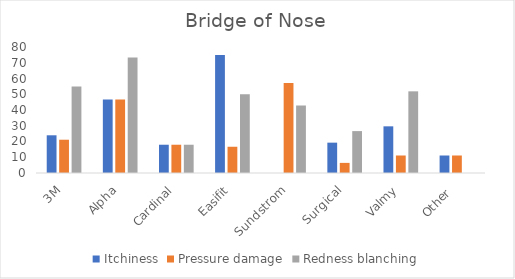
| Category | Itchiness | Pressure damage | Redness blanching |
|---|---|---|---|
| 3M | 23.944 | 21.127 | 54.93 |
| Alpha | 46.667 | 46.667 | 73.333 |
| Cardinal | 17.949 | 17.949 | 17.949 |
| Easifit | 75 | 16.667 | 50 |
| Sundstrom | 0 | 57.143 | 42.857 |
| Surgical | 19.266 | 6.422 | 26.606 |
| Valmy | 29.63 | 11.111 | 51.852 |
| Other  | 11.111 | 11.111 | 0 |